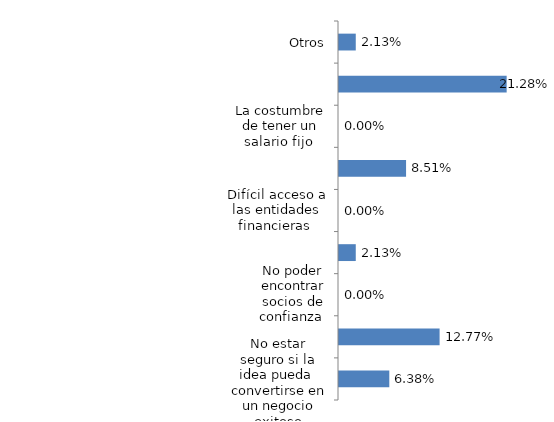
| Category | Series 0 |
|---|---|
| No estar seguro si la idea pueda  convertirse en un negocio exitoso | 0.064 |
| Falta de recursos económicos propios  | 0.128 |
| No poder encontrar socios de confianza  | 0 |
| No tener conocimientos para la creación  de una empresa  | 0.021 |
| Difícil acceso a las entidades financieras  | 0 |
| Falta de apoyo del gobierno | 0.085 |
| La costumbre de tener un salario fijo  | 0 |
| Temor para asumir el riesgo | 0.213 |
| Otros | 0.021 |